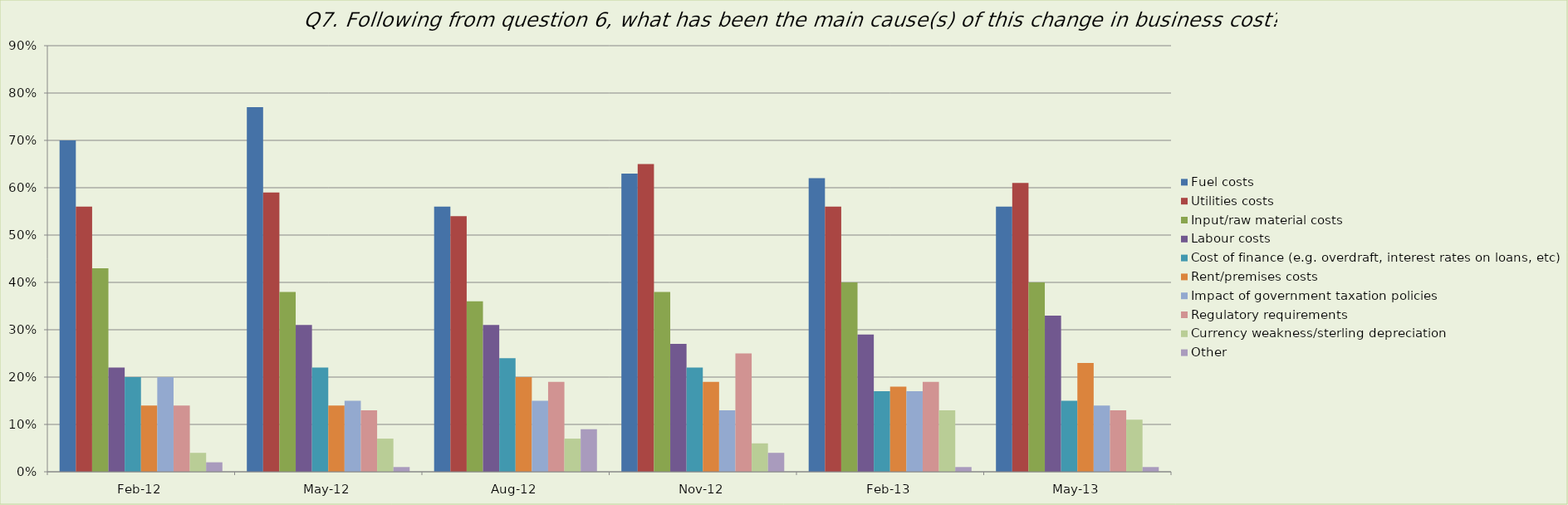
| Category | Fuel costs | Utilities costs | Input/raw material costs | Labour costs | Cost of finance (e.g. overdraft, interest rates on loans, etc) | Rent/premises costs | Impact of government taxation policies | Regulatory requirements | Currency weakness/sterling depreciation | Other |
|---|---|---|---|---|---|---|---|---|---|---|
| 2012-02-01 | 0.7 | 0.56 | 0.43 | 0.22 | 0.2 | 0.14 | 0.2 | 0.14 | 0.04 | 0.02 |
| 2012-05-01 | 0.77 | 0.59 | 0.38 | 0.31 | 0.22 | 0.14 | 0.15 | 0.13 | 0.07 | 0.01 |
| 2012-08-01 | 0.56 | 0.54 | 0.36 | 0.31 | 0.24 | 0.2 | 0.15 | 0.19 | 0.07 | 0.09 |
| 2012-11-01 | 0.63 | 0.65 | 0.38 | 0.27 | 0.22 | 0.19 | 0.13 | 0.25 | 0.06 | 0.04 |
| 2013-02-01 | 0.62 | 0.56 | 0.4 | 0.29 | 0.17 | 0.18 | 0.17 | 0.19 | 0.13 | 0.01 |
| 2013-05-01 | 0.56 | 0.61 | 0.4 | 0.33 | 0.15 | 0.23 | 0.14 | 0.13 | 0.11 | 0.01 |